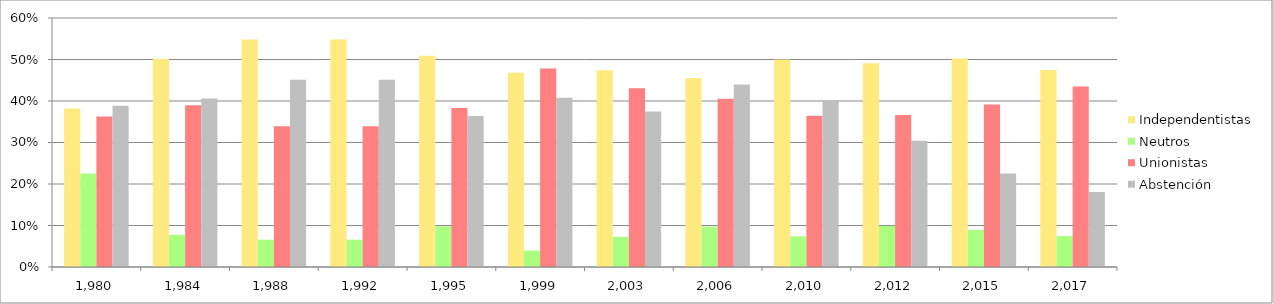
| Category | Independentistas | Neutros | Unionistas | Abstención |
|---|---|---|---|---|
| 1980.0 | 0.382 | 0.226 | 0.363 | 0.389 |
| 1984.0 | 0.502 | 0.078 | 0.39 | 0.406 |
| 1988.0 | 0.548 | 0.066 | 0.339 | 0.451 |
| 1992.0 | 0.548 | 0.066 | 0.339 | 0.451 |
| 1995.0 | 0.509 | 0.098 | 0.383 | 0.364 |
| 1999.0 | 0.468 | 0.04 | 0.478 | 0.408 |
| 2003.0 | 0.474 | 0.073 | 0.43 | 0.375 |
| 2006.0 | 0.456 | 0.097 | 0.406 | 0.44 |
| 2010.0 | 0.5 | 0.074 | 0.365 | 0.4 |
| 2012.0 | 0.491 | 0.099 | 0.366 | 0.304 |
| 2015.0 | 0.502 | 0.089 | 0.392 | 0.226 |
| 2017.0 | 0.475 | 0.074 | 0.435 | 0.181 |